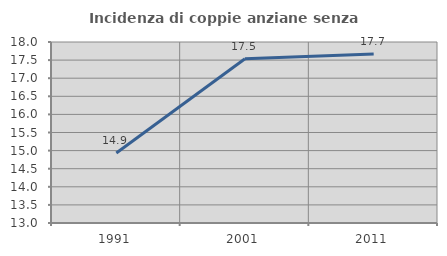
| Category | Incidenza di coppie anziane senza figli  |
|---|---|
| 1991.0 | 14.936 |
| 2001.0 | 17.536 |
| 2011.0 | 17.67 |